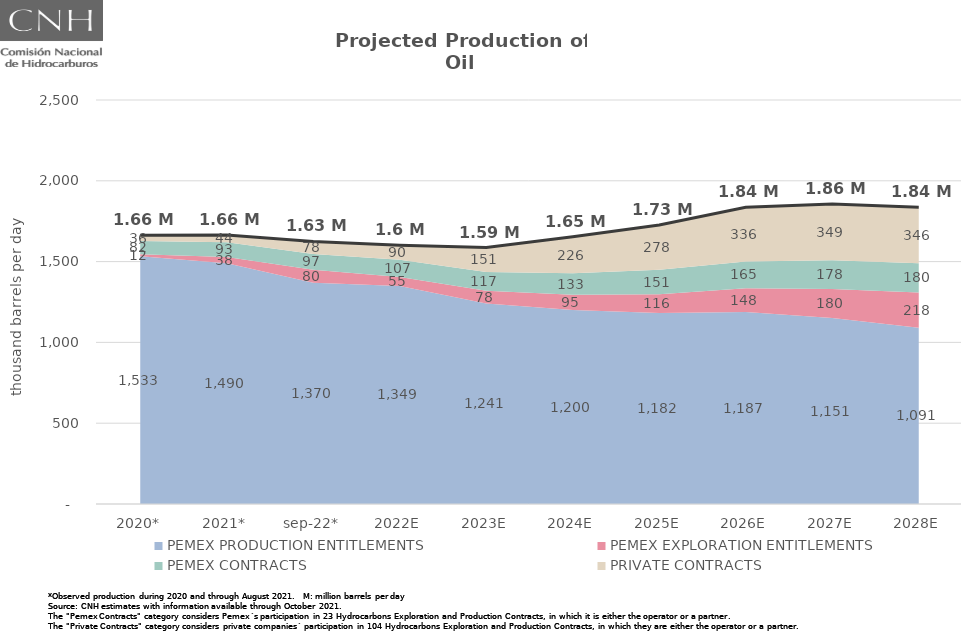
| Category | Total |
|---|---|
| 2020* | 1663.067 |
| 2021* | 1664.715 |
| sep-22* | 1625.017 |
| 2022E | 1601.101 |
| 2023E | 1586.59 |
| 2024E | 1653.739 |
| 2025E | 1726.72 |
| 2026E | 1836.06 |
| 2027E | 1856.982 |
| 2028E | 1835.624 |